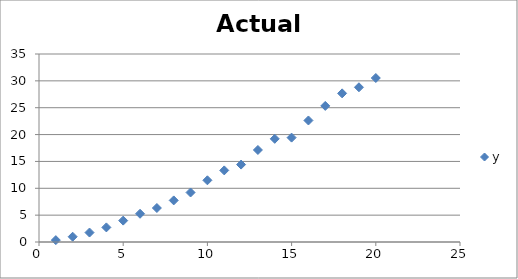
| Category | y |
|---|---|
| 1.0 | 0.352 |
| 2.0 | 0.982 |
| 3.0 | 1.761 |
| 4.0 | 2.717 |
| 5.0 | 3.982 |
| 6.0 | 5.255 |
| 7.0 | 6.329 |
| 8.0 | 7.743 |
| 9.0 | 9.217 |
| 10.0 | 11.486 |
| 11.0 | 13.33 |
| 12.0 | 14.414 |
| 13.0 | 17.133 |
| 14.0 | 19.208 |
| 15.0 | 19.432 |
| 16.0 | 22.623 |
| 17.0 | 25.334 |
| 18.0 | 27.67 |
| 19.0 | 28.804 |
| 20.0 | 30.531 |